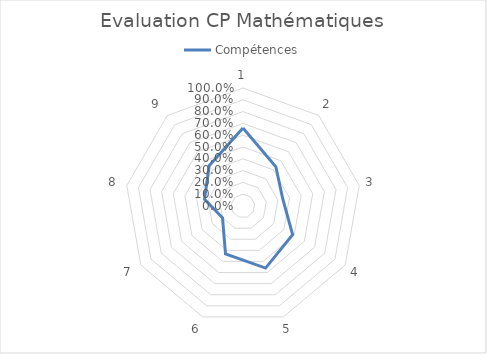
| Category | Compétences |
|---|---|
| 0 | 0.66 |
| 1 | 0.434 |
| 2 | 0.342 |
| 3 | 0.485 |
| 4 | 0.56 |
| 5 | 0.433 |
| 6 | 0.2 |
| 7 | 0.331 |
| 8 | 0.446 |